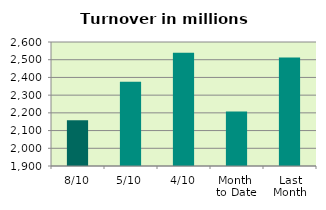
| Category | Series 0 |
|---|---|
| 8/10 | 2158.291 |
| 5/10 | 2375.489 |
| 4/10 | 2539.875 |
| Month 
to Date | 2207.676 |
| Last
Month | 2513.15 |